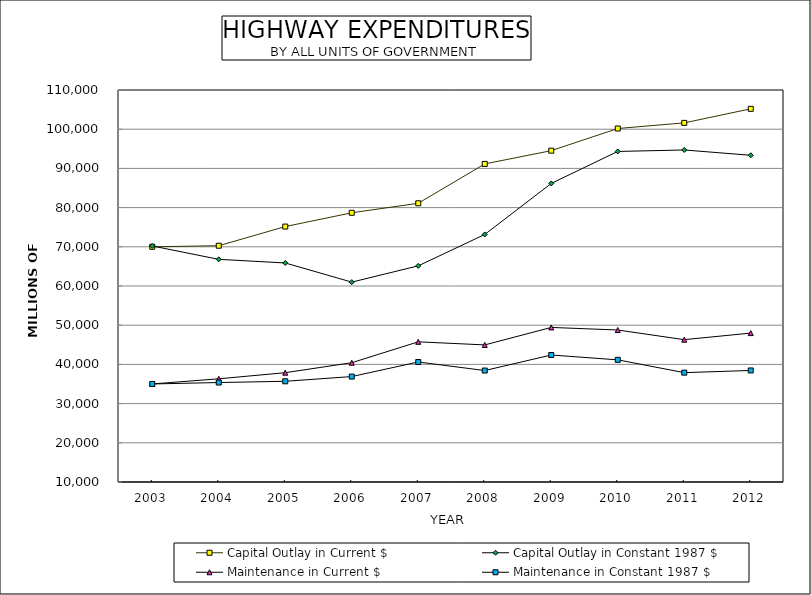
| Category | Capital Outlay in Current $ | Capital Outlay in Constant 1987 $ | Maintenance in Current $ | Maintenance in Constant 1987 $ |
|---|---|---|---|---|
| 2003.0 | 70004 | 70214.644 | 35011 | 35011 |
| 2004.0 | 70274 | 66800.38 | 36327 | 35371.957 |
| 2005.0 | 75162.476 | 65874.212 | 37882.229 | 35690.374 |
| 2006.0 | 78676 | 60989.147 | 40426 | 36896.746 |
| 2007.0 | 81098 | 65138.956 | 45759 | 40615.803 |
| 2008.0 | 91144 | 73149.278 | 44972 | 38434.036 |
| 2009.0 | 94525 | 86166.819 | 49432 | 42394.511 |
| 2010.0 | 100175 | 94326.742 | 48773 | 41158.65 |
| 2011.0 | 101612 | 94698.975 | 46311 | 37897.709 |
| 2012.0 | 105199 | 93344.277 | 47990 | 38453.526 |